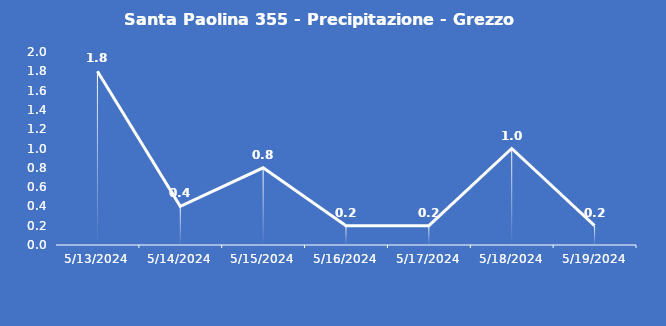
| Category | Santa Paolina 355 - Precipitazione - Grezzo (mm) |
|---|---|
| 5/13/24 | 1.8 |
| 5/14/24 | 0.4 |
| 5/15/24 | 0.8 |
| 5/16/24 | 0.2 |
| 5/17/24 | 0.2 |
| 5/18/24 | 1 |
| 5/19/24 | 0.2 |